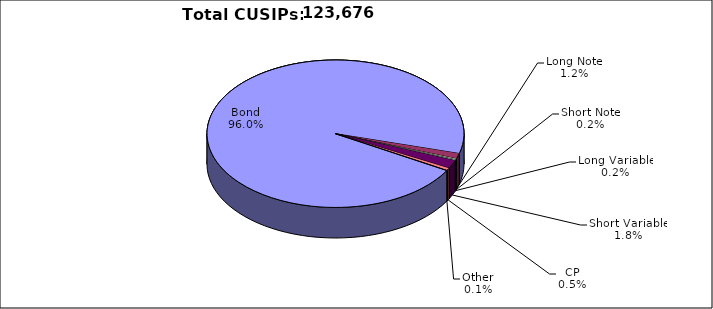
| Category | CUSIPs |
|---|---|
| Bond | 118718 |
| Long Note | 1464 |
| Short Note | 268 |
| Long Variable | 243 |
| Short Variable | 2270 |
| CP | 642 |
| Other | 71 |